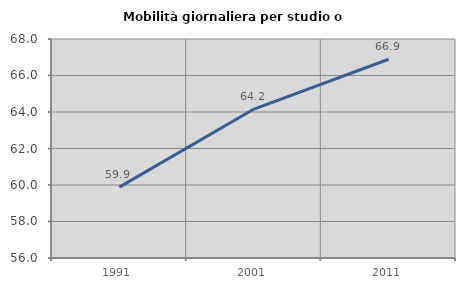
| Category | Mobilità giornaliera per studio o lavoro |
|---|---|
| 1991.0 | 59.882 |
| 2001.0 | 64.162 |
| 2011.0 | 66.891 |